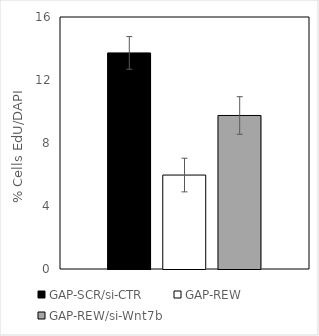
| Category | GAP-SCR/si-CTR | GAP-REW | GAP-REW/si-Wnt7b |
|---|---|---|---|
| 0 | 13.72 | 5.965 | 9.747 |